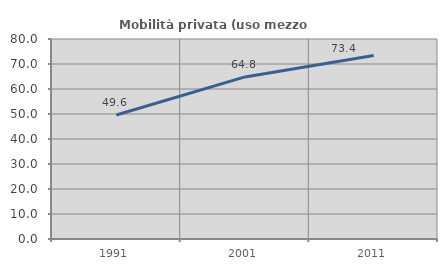
| Category | Mobilità privata (uso mezzo privato) |
|---|---|
| 1991.0 | 49.592 |
| 2001.0 | 64.841 |
| 2011.0 | 73.41 |